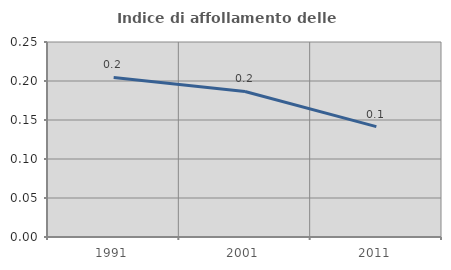
| Category | Indice di affollamento delle abitazioni  |
|---|---|
| 1991.0 | 0.204 |
| 2001.0 | 0.187 |
| 2011.0 | 0.141 |